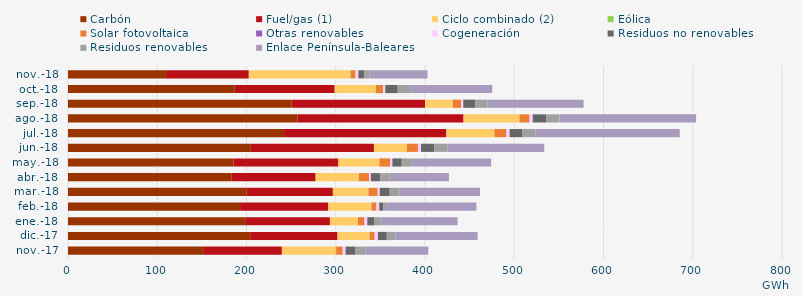
| Category | Carbón | Fuel/gas (1) | Ciclo combinado (2) | Eólica | Solar fotovoltaica | Otras renovables | Cogeneración | Residuos no renovables | Residuos renovables | Enlace Península-Baleares |
|---|---|---|---|---|---|---|---|---|---|---|
| nov.-17 | 152.282 | 87.352 | 60.509 | 0.343 | 7.258 | 0.127 | 3.099 | 11.279 | 11.279 | 70.162 |
| dic.-17 | 204.111 | 97.886 | 35.554 | 0.382 | 5.557 | 0.137 | 3.6 | 9.982 | 9.982 | 91.767 |
| ene.-18 | 198.555 | 94.932 | 31.201 | 0.253 | 7.038 | 0.219 | 3.183 | 7.481 | 7.481 | 86.204 |
| feb.-18 | 192.795 | 98.852 | 48.135 | 0.324 | 5.33 | 0.166 | 3.084 | 4.456 | 4.456 | 99.993 |
| mar.-18 | 199.822 | 96.98 | 39.439 | 0.406 | 10.194 | 0.184 | 2.295 | 11.2 | 11.2 | 89.997 |
| abr.-18 | 183.056 | 94.399 | 48.047 | 0.283 | 11.477 | 0.131 | 1.982 | 10.487 | 10.487 | 66.468 |
| may.-18 | 185.328 | 117.635 | 45.725 | 0.229 | 11.839 | 0.128 | 2.579 | 10.525 | 10.525 | 89.565 |
| jun.-18 | 204.88 | 137.881 | 36.755 | 0.139 | 12.383 | 0.11 | 3.357 | 14.709 | 14.709 | 108.624 |
| jul.-18 | 242.068 | 181.893 | 53.755 | 0.139 | 13.342 | 0.058 | 3.566 | 14.429 | 14.429 | 161.792 |
| ago.-18 | 257.313 | 185.888 | 62.466 | 0.192 | 11.262 | 0.057 | 3.515 | 14.961 | 14.961 | 153.134 |
| sep.-18 | 250.63 | 149.447 | 31.105 | 0.198 | 9.046 | 0.019 | 2.437 | 13.454 | 13.454 | 107.931 |
| oct.-18 | 186.346 | 112.508 | 45.569 | 0.62 | 7.841 | 0.06 | 2.572 | 13.898 | 13.898 | 92.008 |
| nov.-18 | 109.728 | 92.84 | 113.499 | 0.612 | 5.499 | 0.018 | 3.146 | 6.237 | 6.237 | 64.972 |